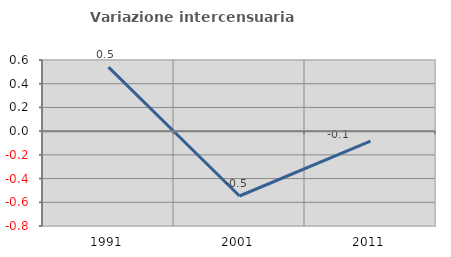
| Category | Variazione intercensuaria annua |
|---|---|
| 1991.0 | 0.54 |
| 2001.0 | -0.547 |
| 2011.0 | -0.084 |